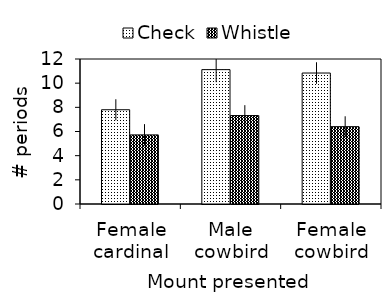
| Category | Check | Whistle |
|---|---|---|
| Female cardinal | 7.8 | 5.72 |
| Male cowbird | 11.12 | 7.32 |
| Female cowbird | 10.84 | 6.4 |